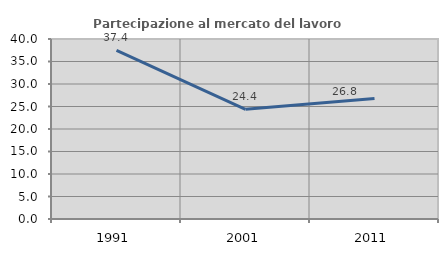
| Category | Partecipazione al mercato del lavoro  femminile |
|---|---|
| 1991.0 | 37.447 |
| 2001.0 | 24.385 |
| 2011.0 | 26.786 |